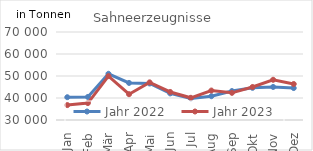
| Category | Jahr 2022 | Jahr 2023 |
|---|---|---|
| Jan | 40345.662 | 36780.276 |
| Feb | 40471.671 | 37692.145 |
| Mär | 51001.519 | 49942.528 |
| Apr | 46850.859 | 41719.235 |
| Mai | 46600.905 | 47108.74 |
| Jun | 42093.032 | 42741.909 |
| Jul | 39819.075 | 40084.486 |
| Aug | 40813.776 | 43394.123 |
| Sep | 43157.046 | 42348.361 |
| Okt | 44630.54 | 45000.775 |
| Nov | 45024.693 | 48285.54 |
| Dez | 44524.014 | 46357.575 |